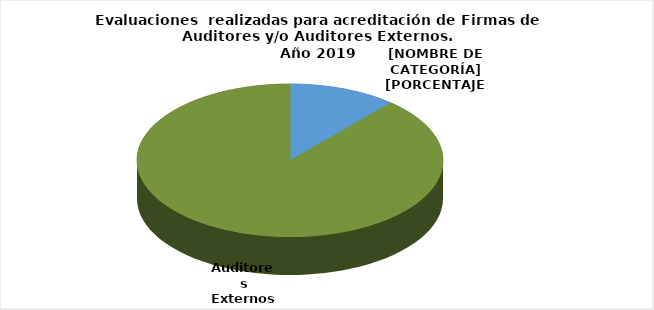
| Category | Series 0 |
|---|---|
| Firmas de Auditores Externos | 9 |
| Auditores Externos | 70 |